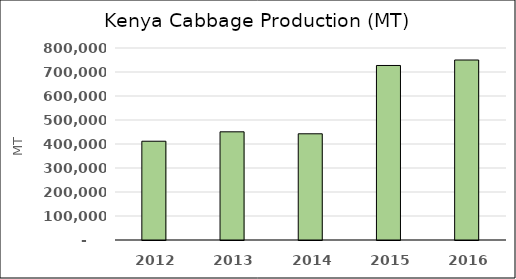
| Category | Series 0 |
|---|---|
| 2012 | 411570 |
| 2013 | 450750.58 |
| 2014 | 442569.34 |
| 2015 | 727151 |
| 2016 | 749940.47 |